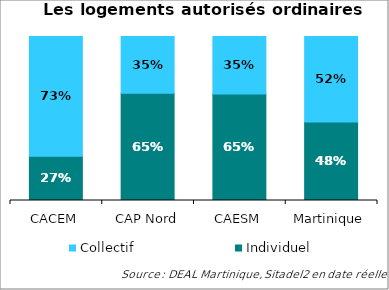
| Category | Individuel | Collectif |
|---|---|---|
| CACEM | 0.27 | 0.73 |
| CAP Nord | 0.654 | 0.346 |
| CAESM | 0.649 | 0.351 |
| Martinique | 0.479 | 0.521 |